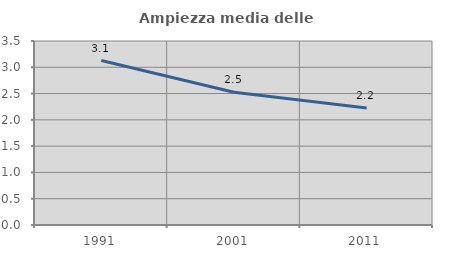
| Category | Ampiezza media delle famiglie |
|---|---|
| 1991.0 | 3.129 |
| 2001.0 | 2.527 |
| 2011.0 | 2.227 |